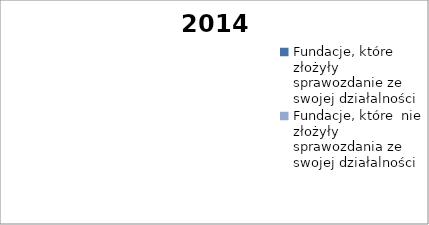
| Category | 2014 |
|---|---|
| Fundacje, które złożyły sprawozdanie ze swojej działalności  | 0 |
| Fundacje, które  nie złożyły sprawozdania ze swojej działalności  | 0 |